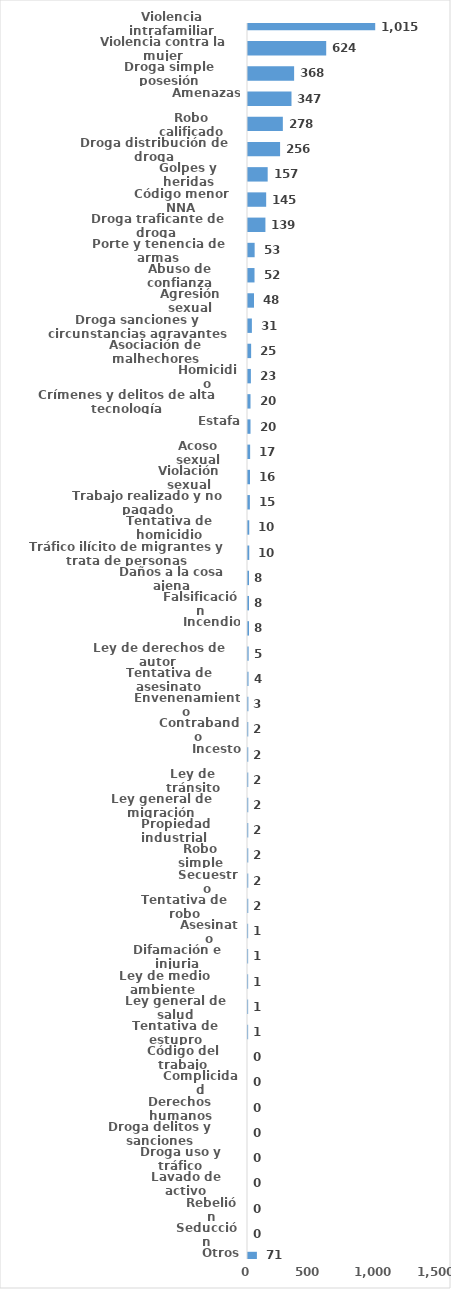
| Category | Series 0 |
|---|---|
| Violencia intrafamiliar | 1015 |
| Violencia contra la mujer | 624 |
| Droga simple posesión | 368 |
| Amenazas | 347 |
| Robo calificado | 278 |
| Droga distribución de droga | 256 |
| Golpes y heridas | 157 |
| Código menor NNA | 145 |
| Droga traficante de droga  | 139 |
| Porte y tenencia de armas | 53 |
| Abuso de confianza | 52 |
| Agresión sexual | 48 |
| Droga sanciones y circunstancias agravantes | 31 |
| Asociación de malhechores | 25 |
| Homicidio | 23 |
| Crímenes y delitos de alta tecnología | 20 |
| Estafa | 20 |
| Acoso sexual | 17 |
| Violación sexual | 16 |
| Trabajo realizado y no pagado | 15 |
| Tentativa de homicidio | 10 |
| Tráfico ilícito de migrantes y trata de personas | 10 |
| Daños a la cosa ajena | 8 |
| Falsificación | 8 |
| Incendio | 8 |
| Ley de derechos de autor  | 5 |
| Tentativa de asesinato | 4 |
| Envenenamiento | 3 |
| Contrabando | 2 |
| Incesto | 2 |
| Ley de tránsito | 2 |
| Ley general de migración | 2 |
| Propiedad industrial  | 2 |
| Robo simple | 2 |
| Secuestro | 2 |
| Tentativa de robo | 2 |
| Asesinato | 1 |
| Difamación e injuria | 1 |
| Ley de medio ambiente  | 1 |
| Ley general de salud | 1 |
| Tentativa de estupro | 1 |
| Código del trabajo | 0 |
| Complicidad | 0 |
| Derechos humanos | 0 |
| Droga delitos y sanciones | 0 |
| Droga uso y tráfico | 0 |
| Lavado de activo | 0 |
| Rebelión | 0 |
| Seducción | 0 |
| Otros | 71 |